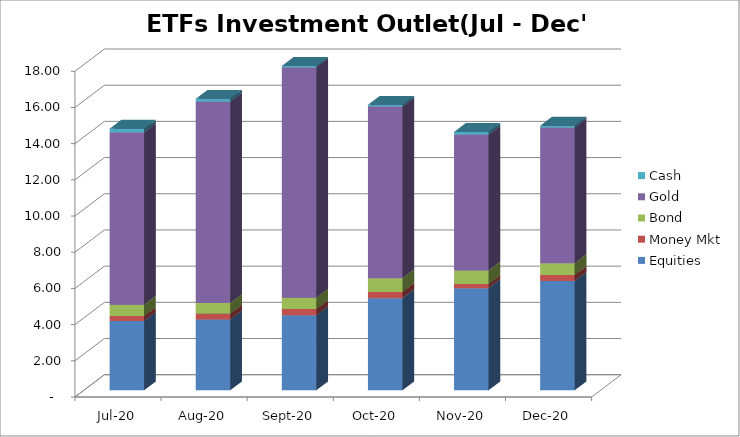
| Category | Equities | Money Mkt | Bond | Gold | Cash |
|---|---|---|---|---|---|
| 2020-07-01 | 3831828644.68 | 272103487.34 | 625862830.11 | 9533055643.75 | 191169576.23 |
| 2020-08-01 | 3913723749.54 | 316071867.88 | 592621089.37 | 11135395115.33 | 152002086.71 |
| 2020-09-01 | 4141425949.9 | 349803623.89 | 626583310.45 | 12731001529.98 | 76107936.49 |
| 2020-10-01 | 5094516142.04 | 343013633.71 | 754956015.68 | 9489073502.64 | 94333366.41 |
| 2020-11-01 | 5645946017.69 | 225450504.88 | 753518055.25 | 7507451398.4 | 141335465.56 |
| 2020-12-01 | 6038222203.19 | 328434807.13 | 655620938.79 | 7507451398.4 | 97257264.43 |